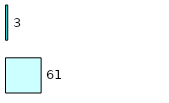
| Category | Series 0 | Series 1 |
|---|---|---|
| 0 | 61 | 3 |